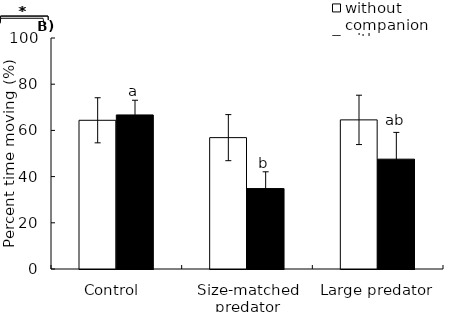
| Category | without companion | with a companion |
|---|---|---|
| Control  | 64.375 | 66.7 |
| Size-matched predator | 56.867 | 34.817 |
| Large predator | 64.55 | 47.55 |